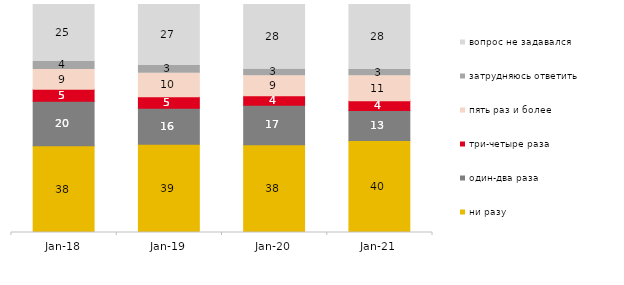
| Category | ни разу | один-два раза | три-четыре раза | пять раз и более | затрудняюсь ответить | вопрос не задавался |
|---|---|---|---|---|---|---|
| 2018-01-01 | 38 | 19.6 | 5.25 | 8.65 | 3.55 | 24.95 |
| 2019-01-01 | 38.7 | 15.85 | 5 | 10.3 | 3.4 | 26.75 |
| 2020-01-01 | 38.465 | 17.376 | 4.158 | 8.713 | 2.97 | 28.317 |
| 2021-01-01 | 40.387 | 13.115 | 4.322 | 10.879 | 2.832 | 28.465 |